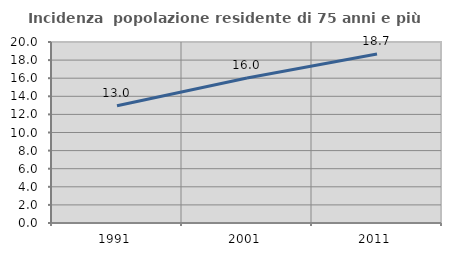
| Category | Incidenza  popolazione residente di 75 anni e più |
|---|---|
| 1991.0 | 12.963 |
| 2001.0 | 16.031 |
| 2011.0 | 18.678 |